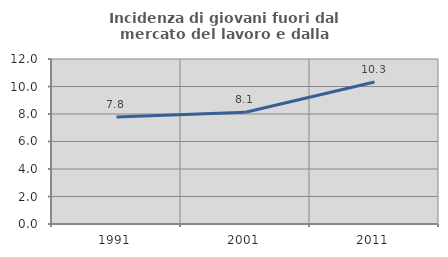
| Category | Incidenza di giovani fuori dal mercato del lavoro e dalla formazione  |
|---|---|
| 1991.0 | 7.779 |
| 2001.0 | 8.133 |
| 2011.0 | 10.329 |